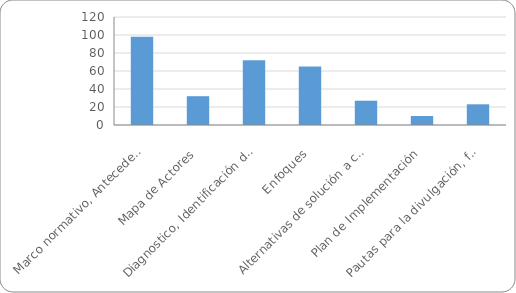
| Category | Series 0 |
|---|---|
| Marco normativo, Antecedentes | 98 |
| Mapa de Actores | 32 |
| Diagnostico, Identificación de problemas | 72 |
| Enfoques | 65 |
| Alternativas de solución a corde al problema central | 27 |
| Plan de Implementación | 10 |
| Pautas para la divulgación, financiación, monitoreo y evaluación | 23 |